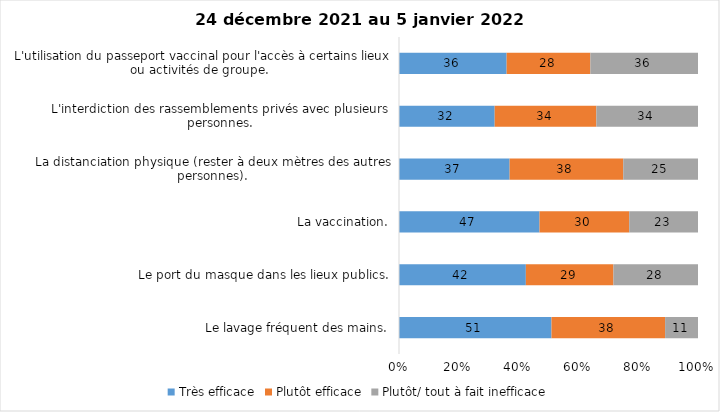
| Category | Très efficace | Plutôt efficace | Plutôt/ tout à fait inefficace |
|---|---|---|---|
| Le lavage fréquent des mains. | 51 | 38 | 11 |
| Le port du masque dans les lieux publics. | 42 | 29 | 28 |
| La vaccination. | 47 | 30 | 23 |
| La distanciation physique (rester à deux mètres des autres personnes). | 37 | 38 | 25 |
| L'interdiction des rassemblements privés avec plusieurs personnes. | 32 | 34 | 34 |
| L'utilisation du passeport vaccinal pour l'accès à certains lieux ou activités de groupe.  | 36 | 28 | 36 |